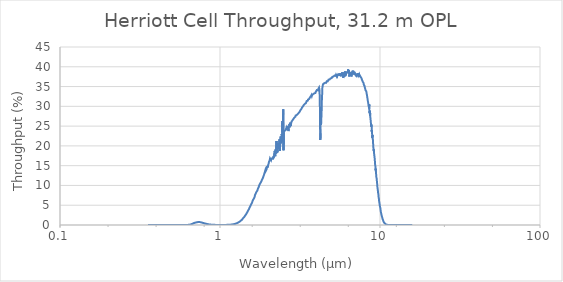
| Category | Throughput (%) |
|---|---|
| 0.355 | 0 |
| 0.365 | 0 |
| 0.375 | 0 |
| 0.385 | 0 |
| 0.395 | 0 |
| 0.405 | 0 |
| 0.415 | 0 |
| 0.425 | 0 |
| 0.435 | 0 |
| 0.445 | 0 |
| 0.455 | 0 |
| 0.465 | 0 |
| 0.475 | 0 |
| 0.485 | 0 |
| 0.495 | 0 |
| 0.505 | 0 |
| 0.515 | 0 |
| 0.525 | 0 |
| 0.535 | 0 |
| 0.545 | 0 |
| 0.555 | 0 |
| 0.565 | 0 |
| 0.575 | 0 |
| 0.585 | 0.001 |
| 0.595 | 0.002 |
| 0.605 | 0.003 |
| 0.615 | 0.008 |
| 0.625 | 0.018 |
| 0.635 | 0.039 |
| 0.645 | 0.078 |
| 0.655 | 0.14 |
| 0.665 | 0.232 |
| 0.675 | 0.349 |
| 0.685 | 0.47 |
| 0.695 | 0.56 |
| 0.705 | 0.643 |
| 0.715 | 0.691 |
| 0.725 | 0.789 |
| 0.735 | 0.77 |
| 0.745 | 0.744 |
| 0.755 | 0.714 |
| 0.765 | 0.652 |
| 0.775 | 0.587 |
| 0.785 | 0.53 |
| 0.795 | 0.453 |
| 0.805 | 0.384 |
| 0.815 | 0.334 |
| 0.825 | 0.275 |
| 0.835 | 0.228 |
| 0.845 | 0.187 |
| 0.855 | 0.152 |
| 0.865 | 0.122 |
| 0.875 | 0.1 |
| 0.885 | 0.08 |
| 0.895 | 0.066 |
| 0.905 | 0.053 |
| 0.915 | 0.043 |
| 0.925 | 0.036 |
| 0.935 | 0.03 |
| 0.945 | 0.025 |
| 0.955 | 0.022 |
| 0.965 | 0.019 |
| 0.975 | 0.017 |
| 0.985 | 0.016 |
| 0.995 | 0.015 |
| 1.005 | 0.015 |
| 1.015 | 0.014 |
| 1.025 | 0.015 |
| 1.035 | 0.015 |
| 1.045 | 0.016 |
| 1.055 | 0.019 |
| 1.065 | 0.021 |
| 1.075 | 0.023 |
| 1.085 | 0.026 |
| 1.095 | 0.029 |
| 1.105 | 0.034 |
| 1.115 | 0.039 |
| 1.125 | 0.045 |
| 1.135 | 0.054 |
| 1.145 | 0.063 |
| 1.155 | 0.074 |
| 1.165 | 0.087 |
| 1.175 | 0.102 |
| 1.185 | 0.121 |
| 1.195 | 0.143 |
| 1.205 | 0.168 |
| 1.215 | 0.195 |
| 1.225 | 0.226 |
| 1.235 | 0.259 |
| 1.245 | 0.303 |
| 1.255 | 0.352 |
| 1.265 | 0.405 |
| 1.275 | 0.456 |
| 1.285 | 0.52 |
| 1.295 | 0.596 |
| 1.305 | 0.67 |
| 1.315 | 0.754 |
| 1.325 | 0.832 |
| 1.335 | 0.934 |
| 1.345 | 1.043 |
| 1.355 | 1.143 |
| 1.365 | 1.284 |
| 1.375 | 1.392 |
| 1.385 | 1.55 |
| 1.395 | 1.722 |
| 1.405 | 1.822 |
| 1.415 | 1.987 |
| 1.425 | 2.148 |
| 1.435 | 2.356 |
| 1.445 | 2.548 |
| 1.455 | 2.698 |
| 1.465 | 2.91 |
| 1.475 | 3.121 |
| 1.485 | 3.31 |
| 1.495 | 3.569 |
| 1.505 | 3.772 |
| 1.515 | 3.989 |
| 1.525 | 4.268 |
| 1.535 | 4.449 |
| 1.545 | 4.706 |
| 1.555 | 4.89 |
| 1.565 | 5.217 |
| 1.575 | 5.321 |
| 1.585 | 5.636 |
| 1.595 | 5.876 |
| 1.605 | 6.26 |
| 1.615 | 6.3 |
| 1.625 | 6.643 |
| 1.635 | 6.896 |
| 1.645 | 7.073 |
| 1.655 | 7.557 |
| 1.665 | 7.686 |
| 1.675 | 7.726 |
| 1.685 | 8.276 |
| 1.695 | 8.248 |
| 1.705 | 8.514 |
| 1.715 | 8.778 |
| 1.725 | 9.16 |
| 1.735 | 9.228 |
| 1.745 | 9.592 |
| 1.755 | 9.816 |
| 1.765 | 10.178 |
| 1.775 | 10.396 |
| 1.785 | 10.539 |
| 1.795 | 10.709 |
| 1.805 | 10.867 |
| 1.815 | 11.021 |
| 1.825 | 11.07 |
| 1.835 | 11.53 |
| 1.845 | 11.704 |
| 1.855 | 11.928 |
| 1.865 | 12.18 |
| 1.875 | 12.469 |
| 1.885 | 12.503 |
| 1.895 | 13.044 |
| 1.905 | 12.936 |
| 1.915 | 13.675 |
| 1.925 | 13.996 |
| 1.935 | 13.692 |
| 1.945 | 13.779 |
| 1.955 | 14.041 |
| 1.965 | 14.038 |
| 1.975 | 14.933 |
| 1.985 | 14.571 |
| 1.995 | 15.079 |
| 2.005 | 15.04 |
| 2.015 | 15.542 |
| 2.025 | 16.019 |
| 2.035 | 16.08 |
| 2.045 | 16.373 |
| 2.055 | 16.833 |
| 2.065 | 16.604 |
| 2.075 | 16.629 |
| 2.085 | 16.395 |
| 2.095 | 16.8 |
| 2.105 | 16.731 |
| 2.115 | 16.66 |
| 2.125 | 16.59 |
| 2.135 | 16.888 |
| 2.145 | 16.606 |
| 2.155 | 17.144 |
| 2.165 | 17.466 |
| 2.175 | 17.093 |
| 2.185 | 18.089 |
| 2.195 | 18.715 |
| 2.205 | 18.358 |
| 2.215 | 17.365 |
| 2.225 | 19.061 |
| 2.235 | 18.347 |
| 2.245 | 18.063 |
| 2.255 | 21.235 |
| 2.265 | 18.253 |
| 2.275 | 19.491 |
| 2.285 | 18.387 |
| 2.295 | 20.122 |
| 2.305 | 19.94 |
| 2.315 | 20.671 |
| 2.325 | 19.267 |
| 2.335 | 20.152 |
| 2.345 | 20.807 |
| 2.355 | 21.665 |
| 2.365 | 18.741 |
| 2.375 | 19.514 |
| 2.385 | 22.047 |
| 2.395 | 22.386 |
| 2.405 | 22.166 |
| 2.415 | 20.646 |
| 2.425 | 20.832 |
| 2.435 | 23.009 |
| 2.445 | 21.188 |
| 2.455 | 26.311 |
| 2.465 | 23.581 |
| 2.475 | 26.264 |
| 2.485 | 29.273 |
| 2.495 | 18.904 |
| 2.505 | 23.476 |
| 2.515 | 23.465 |
| 2.525 | 23.464 |
| 2.535 | 23.845 |
| 2.545 | 23.77 |
| 2.555 | 23.868 |
| 2.565 | 24.016 |
| 2.575 | 23.999 |
| 2.585 | 23.791 |
| 2.595 | 24.472 |
| 2.61 | 24.069 |
| 2.619 | 24.404 |
| 2.63 | 24.73 |
| 2.64 | 25.054 |
| 2.65 | 24.877 |
| 2.659 | 24.951 |
| 2.67 | 24.289 |
| 2.68 | 23.738 |
| 2.689 | 24.238 |
| 2.7 | 25.026 |
| 2.71 | 25.002 |
| 2.719 | 25.543 |
| 2.73 | 25.026 |
| 2.739 | 24.711 |
| 2.749 | 25.871 |
| 2.76 | 24.991 |
| 2.769 | 25.34 |
| 2.78 | 25.629 |
| 2.789 | 25.524 |
| 2.8 | 26.133 |
| 2.809 | 26.311 |
| 2.82 | 26.184 |
| 2.829 | 26.386 |
| 2.839 | 26.475 |
| 2.849 | 26.586 |
| 2.859 | 26.516 |
| 2.87 | 26.714 |
| 2.879 | 26.824 |
| 2.889 | 26.983 |
| 2.899 | 26.963 |
| 2.909 | 27.118 |
| 2.919 | 27.047 |
| 2.929 | 27.143 |
| 2.939 | 27.264 |
| 2.949 | 27.146 |
| 2.959 | 27.371 |
| 2.969 | 27.657 |
| 2.979 | 27.515 |
| 2.989 | 27.591 |
| 2.999 | 27.599 |
| 3.009 | 27.644 |
| 3.019 | 27.819 |
| 3.029 | 27.681 |
| 3.039 | 27.846 |
| 3.049 | 27.993 |
| 3.059 | 27.909 |
| 3.069 | 28.086 |
| 3.079 | 28.047 |
| 3.089 | 28.216 |
| 3.099 | 28.3 |
| 3.109 | 28.369 |
| 3.119 | 28.568 |
| 3.129 | 28.496 |
| 3.139 | 28.596 |
| 3.149 | 28.645 |
| 3.159 | 28.729 |
| 3.169 | 28.857 |
| 3.179 | 29.015 |
| 3.189 | 28.944 |
| 3.199 | 28.877 |
| 3.209 | 29.117 |
| 3.219 | 29.262 |
| 3.229 | 29.367 |
| 3.239 | 29.441 |
| 3.249 | 29.616 |
| 3.259 | 29.727 |
| 3.269 | 29.682 |
| 3.279 | 29.849 |
| 3.289 | 29.842 |
| 3.299 | 29.959 |
| 3.309 | 30.062 |
| 3.319 | 30.038 |
| 3.329 | 30.131 |
| 3.339 | 30.205 |
| 3.349 | 30.417 |
| 3.359 | 30.64 |
| 3.369 | 30.48 |
| 3.379 | 30.495 |
| 3.389 | 30.662 |
| 3.399 | 30.64 |
| 3.409 | 30.671 |
| 3.419 | 30.657 |
| 3.429 | 30.588 |
| 3.439 | 30.853 |
| 3.449 | 30.881 |
| 3.459 | 31.052 |
| 3.469 | 31.121 |
| 3.479 | 31.327 |
| 3.489 | 31.214 |
| 3.499 | 31.28 |
| 3.509 | 31.309 |
| 3.519 | 31.379 |
| 3.529 | 31.212 |
| 3.539 | 31.449 |
| 3.549 | 31.706 |
| 3.559 | 31.851 |
| 3.569 | 31.648 |
| 3.579 | 31.757 |
| 3.589 | 31.771 |
| 3.599 | 31.787 |
| 3.609 | 31.873 |
| 3.619 | 32.071 |
| 3.629 | 32.114 |
| 3.639 | 32.052 |
| 3.649 | 32.267 |
| 3.659 | 32.213 |
| 3.669 | 32.209 |
| 3.679 | 32.199 |
| 3.689 | 32.462 |
| 3.699 | 32.568 |
| 3.709 | 32.603 |
| 3.719 | 32.686 |
| 3.729 | 32.862 |
| 3.739 | 32.723 |
| 3.749 | 32.602 |
| 3.759 | 32.669 |
| 3.769 | 32.901 |
| 3.779 | 32.769 |
| 3.789 | 32.892 |
| 3.799 | 32.893 |
| 3.809 | 33.019 |
| 3.819 | 32.967 |
| 3.829 | 33.112 |
| 3.839 | 33.062 |
| 3.849 | 33.159 |
| 3.859 | 33.295 |
| 3.869 | 33.19 |
| 3.879 | 33.294 |
| 3.889 | 33.303 |
| 3.899 | 33.482 |
| 3.909 | 33.531 |
| 3.919 | 33.456 |
| 3.929 | 33.26 |
| 3.939 | 33.322 |
| 3.949 | 33.374 |
| 3.959 | 33.57 |
| 3.968 | 33.685 |
| 3.979 | 33.749 |
| 3.989 | 33.602 |
| 3.999 | 33.657 |
| 4.009 | 33.827 |
| 4.018 | 33.811 |
| 4.029 | 34.104 |
| 4.039 | 33.975 |
| 4.049 | 33.992 |
| 4.058 | 34.243 |
| 4.069 | 34.214 |
| 4.078 | 34.195 |
| 4.089 | 34.046 |
| 4.098 | 34.209 |
| 4.109 | 34.249 |
| 4.118 | 34.407 |
| 4.129 | 34.486 |
| 4.138 | 34.612 |
| 4.148 | 34.511 |
| 4.159 | 34.75 |
| 4.168 | 34.646 |
| 4.178 | 34.627 |
| 4.189 | 34.024 |
| 4.198 | 32.441 |
| 4.208 | 30.313 |
| 4.218 | 28.028 |
| 4.228 | 22.285 |
| 4.238 | 21.488 |
| 4.248 | 23.218 |
| 4.258 | 27.026 |
| 4.268 | 25.346 |
| 4.278 | 25.284 |
| 4.288 | 25.642 |
| 4.298 | 26.794 |
| 4.308 | 27.859 |
| 4.318 | 28.921 |
| 4.328 | 31.008 |
| 4.338 | 32.16 |
| 4.348 | 32.924 |
| 4.358 | 34.471 |
| 4.368 | 34.861 |
| 4.378 | 34.96 |
| 4.388 | 35.166 |
| 4.398 | 35.529 |
| 4.408 | 35.377 |
| 4.418 | 35.33 |
| 4.428 | 35.413 |
| 4.438 | 35.458 |
| 4.448 | 35.543 |
| 4.458 | 35.638 |
| 4.468 | 35.81 |
| 4.478 | 35.705 |
| 4.488 | 35.612 |
| 4.498 | 35.747 |
| 4.508 | 35.781 |
| 4.518 | 35.861 |
| 4.528 | 35.915 |
| 4.538 | 35.946 |
| 4.548 | 35.945 |
| 4.558 | 35.836 |
| 4.568 | 36.024 |
| 4.578 | 35.982 |
| 4.588 | 36.022 |
| 4.598 | 35.979 |
| 4.608 | 35.937 |
| 4.618 | 35.988 |
| 4.628 | 36.098 |
| 4.638 | 36.073 |
| 4.648 | 36.338 |
| 4.658 | 36.424 |
| 4.668 | 36.24 |
| 4.678 | 36.207 |
| 4.688 | 36.219 |
| 4.698 | 36.3 |
| 4.708 | 36.231 |
| 4.718 | 36.34 |
| 4.728 | 36.453 |
| 4.738 | 36.54 |
| 4.748 | 36.567 |
| 4.758 | 36.556 |
| 4.768 | 36.747 |
| 4.778 | 36.724 |
| 4.788 | 36.591 |
| 4.798 | 36.719 |
| 4.808 | 36.596 |
| 4.818 | 36.65 |
| 4.828 | 36.718 |
| 4.838 | 36.778 |
| 4.848 | 36.728 |
| 4.858 | 36.714 |
| 4.868 | 36.869 |
| 4.878 | 36.851 |
| 4.888 | 36.846 |
| 4.898 | 36.81 |
| 4.908 | 37.07 |
| 4.918 | 37.049 |
| 4.928 | 36.998 |
| 4.938 | 37.097 |
| 4.948 | 37.112 |
| 4.958 | 37.067 |
| 4.968 | 37.097 |
| 4.978 | 37.112 |
| 4.988 | 37.139 |
| 4.998 | 37.045 |
| 5.008 | 36.979 |
| 5.018 | 37.087 |
| 5.028 | 37.158 |
| 5.038 | 37.457 |
| 5.048 | 37.462 |
| 5.058 | 37.416 |
| 5.068 | 37.397 |
| 5.078 | 37.249 |
| 5.088 | 37.29 |
| 5.098 | 37.434 |
| 5.107 | 37.646 |
| 5.118 | 37.539 |
| 5.128 | 37.459 |
| 5.138 | 37.516 |
| 5.147 | 37.363 |
| 5.158 | 37.459 |
| 5.168 | 37.54 |
| 5.178 | 37.563 |
| 5.187 | 37.747 |
| 5.198 | 37.779 |
| 5.208 | 37.562 |
| 5.218 | 37.682 |
| 5.227 | 37.751 |
| 5.238 | 37.706 |
| 5.248 | 37.806 |
| 5.257 | 37.831 |
| 5.268 | 37.747 |
| 5.278 | 37.7 |
| 5.288 | 37.701 |
| 5.297 | 37.69 |
| 5.308 | 37.96 |
| 5.318 | 37.937 |
| 5.327 | 37.928 |
| 5.337 | 38.012 |
| 5.348 | 37.686 |
| 5.358 | 37.665 |
| 5.367 | 37.901 |
| 5.378 | 38.16 |
| 5.388 | 38.177 |
| 5.397 | 38.119 |
| 5.407 | 37.932 |
| 5.418 | 37.751 |
| 5.428 | 37.572 |
| 5.437 | 37.731 |
| 5.448 | 38.121 |
| 5.458 | 38.056 |
| 5.467 | 37.759 |
| 5.477 | 37.75 |
| 5.488 | 37.928 |
| 5.497 | 38.094 |
| 5.507 | 38.162 |
| 5.518 | 38.075 |
| 5.527 | 38.149 |
| 5.537 | 38.332 |
| 5.548 | 38.177 |
| 5.558 | 38.016 |
| 5.567 | 38.108 |
| 5.578 | 37.942 |
| 5.588 | 38.11 |
| 5.597 | 38.351 |
| 5.608 | 38.363 |
| 5.618 | 38.378 |
| 5.627 | 38.473 |
| 5.637 | 38.395 |
| 5.648 | 37.906 |
| 5.657 | 38.022 |
| 5.667 | 38.237 |
| 5.678 | 38.288 |
| 5.687 | 38.25 |
| 5.697 | 38.432 |
| 5.707 | 38.434 |
| 5.717 | 37.614 |
| 5.727 | 37.753 |
| 5.737 | 38.068 |
| 5.747 | 38.363 |
| 5.758 | 38.427 |
| 5.767 | 38.118 |
| 5.777 | 37.788 |
| 5.788 | 38.334 |
| 5.797 | 38.597 |
| 5.807 | 38.77 |
| 5.818 | 38.245 |
| 5.827 | 37.776 |
| 5.837 | 37.924 |
| 5.847 | 38.559 |
| 5.857 | 38.46 |
| 5.867 | 38.213 |
| 5.877 | 37.918 |
| 5.887 | 37.159 |
| 5.898 | 37.425 |
| 5.907 | 37.931 |
| 5.917 | 38.255 |
| 5.927 | 38.129 |
| 5.937 | 37.715 |
| 5.947 | 37.451 |
| 5.957 | 38.185 |
| 5.967 | 38.343 |
| 5.978 | 38.33 |
| 5.987 | 38.098 |
| 5.997 | 38.138 |
| 6.007 | 38.298 |
| 6.017 | 38.258 |
| 6.027 | 38.54 |
| 6.037 | 38.833 |
| 6.047 | 38.601 |
| 6.057 | 37.626 |
| 6.067 | 37.576 |
| 6.077 | 37.618 |
| 6.087 | 38.342 |
| 6.097 | 38.543 |
| 6.107 | 38.374 |
| 6.117 | 37.861 |
| 6.127 | 38.013 |
| 6.137 | 38.211 |
| 6.147 | 38.176 |
| 6.157 | 37.989 |
| 6.167 | 38.179 |
| 6.177 | 38.418 |
| 6.187 | 38.261 |
| 6.197 | 38.321 |
| 6.207 | 38.43 |
| 6.217 | 38.444 |
| 6.227 | 38.556 |
| 6.237 | 38.685 |
| 6.247 | 38.808 |
| 6.257 | 38.842 |
| 6.267 | 38.636 |
| 6.277 | 38.411 |
| 6.287 | 38.34 |
| 6.297 | 38.598 |
| 6.307 | 38.94 |
| 6.317 | 39.357 |
| 6.327 | 39.455 |
| 6.337 | 38.995 |
| 6.347 | 38.502 |
| 6.357 | 38.651 |
| 6.367 | 38.665 |
| 6.377 | 38.58 |
| 6.387 | 38.697 |
| 6.397 | 39.137 |
| 6.407 | 38.842 |
| 6.417 | 37.928 |
| 6.427 | 37.553 |
| 6.437 | 37.884 |
| 6.446 | 38.202 |
| 6.457 | 38.71 |
| 6.467 | 38.742 |
| 6.477 | 38.539 |
| 6.487 | 38.115 |
| 6.497 | 37.686 |
| 6.507 | 37.965 |
| 6.517 | 38.173 |
| 6.527 | 38.341 |
| 6.537 | 38.504 |
| 6.547 | 38.545 |
| 6.557 | 38.425 |
| 6.567 | 37.897 |
| 6.577 | 37.672 |
| 6.587 | 37.681 |
| 6.597 | 38.179 |
| 6.607 | 38.472 |
| 6.617 | 38.62 |
| 6.627 | 37.998 |
| 6.637 | 37.547 |
| 6.647 | 37.74 |
| 6.657 | 38.234 |
| 6.666 | 38.655 |
| 6.677 | 38.58 |
| 6.686 | 38.583 |
| 6.697 | 38.701 |
| 6.706 | 38.504 |
| 6.717 | 38.258 |
| 6.726 | 38.366 |
| 6.737 | 39.009 |
| 6.746 | 39.166 |
| 6.757 | 39.202 |
| 6.766 | 38.97 |
| 6.777 | 38.697 |
| 6.787 | 38.417 |
| 6.797 | 38.668 |
| 6.807 | 38.943 |
| 6.816 | 39.061 |
| 6.827 | 38.987 |
| 6.836 | 38.871 |
| 6.847 | 38.842 |
| 6.856 | 38.526 |
| 6.867 | 38.05 |
| 6.876 | 38.275 |
| 6.887 | 38.589 |
| 6.897 | 38.724 |
| 6.906 | 38.538 |
| 6.917 | 38.501 |
| 6.926 | 38.561 |
| 6.937 | 38.748 |
| 6.946 | 38.648 |
| 6.956 | 38.392 |
| 6.967 | 38.096 |
| 6.976 | 38.216 |
| 6.987 | 38.335 |
| 6.996 | 38.33 |
| 7.007 | 38.281 |
| 7.016 | 38.242 |
| 7.026 | 38.168 |
| 7.037 | 37.964 |
| 7.046 | 37.854 |
| 7.057 | 37.825 |
| 7.066 | 38.123 |
| 7.076 | 38.231 |
| 7.087 | 38.269 |
| 7.096 | 38.24 |
| 7.107 | 38.138 |
| 7.116 | 38.136 |
| 7.126 | 38.153 |
| 7.137 | 38.072 |
| 7.146 | 37.915 |
| 7.156 | 37.824 |
| 7.166 | 37.827 |
| 7.176 | 38.06 |
| 7.187 | 38.142 |
| 7.196 | 38.15 |
| 7.206 | 37.992 |
| 7.217 | 38.011 |
| 7.226 | 38.104 |
| 7.236 | 38.302 |
| 7.246 | 38.258 |
| 7.256 | 38.161 |
| 7.266 | 38.046 |
| 7.276 | 37.961 |
| 7.286 | 38.055 |
| 7.296 | 38.175 |
| 7.306 | 38.295 |
| 7.316 | 38.184 |
| 7.327 | 38.014 |
| 7.336 | 37.8 |
| 7.346 | 37.594 |
| 7.357 | 37.613 |
| 7.366 | 37.689 |
| 7.376 | 37.847 |
| 7.386 | 37.916 |
| 7.396 | 38.013 |
| 7.406 | 38.124 |
| 7.416 | 38.088 |
| 7.426 | 38.02 |
| 7.436 | 37.945 |
| 7.446 | 37.766 |
| 7.456 | 37.56 |
| 7.466 | 37.379 |
| 7.476 | 37.354 |
| 7.486 | 37.496 |
| 7.496 | 37.609 |
| 7.506 | 37.677 |
| 7.516 | 37.595 |
| 7.526 | 37.516 |
| 7.536 | 37.472 |
| 7.546 | 37.519 |
| 7.556 | 37.52 |
| 7.566 | 37.483 |
| 7.576 | 37.431 |
| 7.586 | 37.397 |
| 7.596 | 37.367 |
| 7.606 | 37.331 |
| 7.616 | 37.261 |
| 7.626 | 37.197 |
| 7.636 | 37.146 |
| 7.646 | 37.173 |
| 7.656 | 37.158 |
| 7.666 | 37.072 |
| 7.676 | 36.897 |
| 7.686 | 36.825 |
| 7.696 | 36.81 |
| 7.706 | 36.829 |
| 7.716 | 36.894 |
| 7.726 | 36.837 |
| 7.736 | 36.724 |
| 7.746 | 36.55 |
| 7.756 | 36.478 |
| 7.766 | 36.424 |
| 7.776 | 36.388 |
| 7.786 | 36.332 |
| 7.796 | 36.258 |
| 7.806 | 36.168 |
| 7.816 | 36.082 |
| 7.826 | 36.073 |
| 7.836 | 36.088 |
| 7.846 | 36.205 |
| 7.855 | 36.209 |
| 7.866 | 36.189 |
| 7.876 | 36.148 |
| 7.886 | 36.025 |
| 7.896 | 35.854 |
| 7.905 | 35.685 |
| 7.916 | 35.5 |
| 7.926 | 35.406 |
| 7.936 | 35.35 |
| 7.946 | 35.32 |
| 7.955 | 35.374 |
| 7.966 | 35.347 |
| 7.976 | 35.299 |
| 7.986 | 35.27 |
| 7.996 | 35.205 |
| 8.005 | 35.123 |
| 8.016 | 34.98 |
| 8.026 | 34.862 |
| 8.036 | 34.751 |
| 8.046 | 34.662 |
| 8.056 | 34.608 |
| 8.065 | 34.559 |
| 8.075 | 34.514 |
| 8.086 | 34.468 |
| 8.096 | 34.345 |
| 8.106 | 34.213 |
| 8.116 | 34.08 |
| 8.125 | 34.02 |
| 8.135 | 33.981 |
| 8.146 | 33.957 |
| 8.156 | 34.042 |
| 8.166 | 34.021 |
| 8.176 | 33.999 |
| 8.186 | 33.975 |
| 8.195 | 33.9 |
| 8.205 | 33.846 |
| 8.215 | 33.763 |
| 8.226 | 33.597 |
| 8.236 | 33.407 |
| 8.246 | 33.213 |
| 8.256 | 33.152 |
| 8.266 | 33.114 |
| 8.275 | 33.058 |
| 8.285 | 32.993 |
| 8.295 | 32.82 |
| 8.305 | 32.623 |
| 8.315 | 32.448 |
| 8.326 | 32.299 |
| 8.336 | 32.175 |
| 8.346 | 32.075 |
| 8.356 | 31.949 |
| 8.366 | 31.769 |
| 8.375 | 31.624 |
| 8.385 | 31.443 |
| 8.395 | 31.311 |
| 8.405 | 31.204 |
| 8.415 | 31.12 |
| 8.425 | 31.085 |
| 8.435 | 30.948 |
| 8.445 | 30.809 |
| 8.455 | 30.595 |
| 8.465 | 30.454 |
| 8.476 | 30.287 |
| 8.486 | 30.144 |
| 8.496 | 30.023 |
| 8.506 | 29.901 |
| 8.516 | 29.996 |
| 8.526 | 30.133 |
| 8.536 | 29.64 |
| 8.555 | 29.392 |
| 8.565 | 30.483 |
| 8.575 | 29.327 |
| 8.585 | 29.146 |
| 8.595 | 28.692 |
| 8.605 | 28.513 |
| 8.615 | 28.302 |
| 8.625 | 28.887 |
| 8.635 | 28.364 |
| 8.645 | 27.975 |
| 8.655 | 27.626 |
| 8.665 | 27.889 |
| 8.675 | 28.266 |
| 8.685 | 27.976 |
| 8.695 | 27.473 |
| 8.705 | 27.191 |
| 8.715 | 27.366 |
| 8.735 | 26.622 |
| 8.745 | 26.326 |
| 8.755 | 26.153 |
| 8.765 | 26.267 |
| 8.775 | 25.766 |
| 8.785 | 25.605 |
| 8.795 | 25.462 |
| 8.805 | 24.895 |
| 8.815 | 25.403 |
| 8.825 | 25.288 |
| 8.835 | 25.234 |
| 8.845 | 25.349 |
| 8.855 | 25.513 |
| 8.865 | 24.776 |
| 8.875 | 24.255 |
| 8.885 | 23.579 |
| 8.895 | 24.016 |
| 8.905 | 23.38 |
| 8.925 | 23.243 |
| 8.935 | 22.851 |
| 8.945 | 23.048 |
| 8.955 | 22.071 |
| 8.965 | 22.71 |
| 8.975 | 22.847 |
| 8.985 | 22.182 |
| 8.995 | 21.857 |
| 9.005 | 21.952 |
| 9.015 | 21.706 |
| 9.035 | 21.521 |
| 9.045 | 21.173 |
| 9.055 | 20.679 |
| 9.065 | 20.251 |
| 9.075 | 20.481 |
| 9.085 | 19.665 |
| 9.095 | 19.89 |
| 9.115 | 19.104 |
| 9.125 | 19.33 |
| 9.135 | 19.105 |
| 9.145 | 18.695 |
| 9.155 | 19.089 |
| 9.175 | 18.366 |
| 9.185 | 18.512 |
| 9.195 | 17.897 |
| 9.205 | 17.74 |
| 9.215 | 17.587 |
| 9.235 | 17.442 |
| 9.245 | 17.347 |
| 9.255 | 16.977 |
| 9.265 | 16.859 |
| 9.275 | 16.473 |
| 9.295 | 16.07 |
| 9.305 | 15.567 |
| 9.314 | 15.521 |
| 9.325 | 15.249 |
| 9.345 | 15.069 |
| 9.355 | 14.92 |
| 9.364 | 14.888 |
| 9.375 | 14.254 |
| 9.385 | 14.421 |
| 9.395 | 13.931 |
| 9.404 | 13.869 |
| 9.415 | 14.22 |
| 9.425 | 13.521 |
| 9.435 | 13.724 |
| 9.444 | 13.44 |
| 9.455 | 13.308 |
| 9.465 | 12.697 |
| 9.475 | 12.338 |
| 9.484 | 12.379 |
| 9.495 | 12.032 |
| 9.505 | 12.13 |
| 9.515 | 11.903 |
| 9.524 | 12.227 |
| 9.535 | 11.695 |
| 9.545 | 11.775 |
| 9.554 | 11.481 |
| 9.564 | 11.034 |
| 9.575 | 10.821 |
| 9.585 | 10.794 |
| 9.594 | 10.535 |
| 9.605 | 10.192 |
| 9.615 | 10.14 |
| 9.624 | 9.749 |
| 9.634 | 9.701 |
| 9.645 | 9.403 |
| 9.654 | 9.495 |
| 9.664 | 9.605 |
| 9.675 | 9.099 |
| 9.684 | 9.262 |
| 9.694 | 8.758 |
| 9.705 | 8.687 |
| 9.714 | 8.668 |
| 9.724 | 8.367 |
| 9.735 | 8.09 |
| 9.744 | 7.846 |
| 9.754 | 8.107 |
| 9.765 | 7.788 |
| 9.774 | 7.579 |
| 9.784 | 7.428 |
| 9.795 | 7.118 |
| 9.804 | 7.253 |
| 9.815 | 7.009 |
| 9.824 | 6.832 |
| 9.834 | 6.821 |
| 9.845 | 6.658 |
| 9.854 | 6.553 |
| 9.864 | 6.248 |
| 9.875 | 5.991 |
| 9.884 | 6.098 |
| 9.895 | 5.848 |
| 9.904 | 5.823 |
| 9.914 | 5.824 |
| 9.924 | 5.536 |
| 9.934 | 5.41 |
| 9.945 | 5.235 |
| 9.954 | 5.165 |
| 9.964 | 4.871 |
| 9.974 | 4.823 |
| 9.984 | 4.64 |
| 9.994 | 4.712 |
| 10.004 | 4.693 |
| 10.015 | 4.537 |
| 10.024 | 4.639 |
| 10.034 | 4.322 |
| 10.044 | 4.377 |
| 10.054 | 4.2 |
| 10.064 | 3.988 |
| 10.074 | 3.932 |
| 10.084 | 3.841 |
| 10.094 | 3.662 |
| 10.104 | 3.677 |
| 10.114 | 3.326 |
| 10.124 | 3.465 |
| 10.134 | 3.316 |
| 10.144 | 3.223 |
| 10.154 | 3.06 |
| 10.164 | 3.101 |
| 10.174 | 3.019 |
| 10.184 | 3.051 |
| 10.194 | 2.748 |
| 10.204 | 2.753 |
| 10.214 | 2.664 |
| 10.224 | 2.572 |
| 10.234 | 2.444 |
| 10.244 | 2.329 |
| 10.254 | 2.412 |
| 10.264 | 2.356 |
| 10.274 | 2.164 |
| 10.284 | 2.196 |
| 10.294 | 2.18 |
| 10.304 | 2.012 |
| 10.314 | 1.913 |
| 10.324 | 1.919 |
| 10.334 | 1.872 |
| 10.344 | 1.731 |
| 10.354 | 1.701 |
| 10.364 | 1.586 |
| 10.374 | 1.667 |
| 10.384 | 1.6 |
| 10.394 | 1.507 |
| 10.404 | 1.433 |
| 10.414 | 1.527 |
| 10.424 | 1.349 |
| 10.434 | 1.346 |
| 10.444 | 1.244 |
| 10.454 | 1.183 |
| 10.464 | 1.192 |
| 10.474 | 1.155 |
| 10.484 | 1.143 |
| 10.494 | 1.021 |
| 10.504 | 0.967 |
| 10.514 | 1.002 |
| 10.524 | 0.985 |
| 10.534 | 0.882 |
| 10.544 | 0.841 |
| 10.554 | 0.851 |
| 10.564 | 0.711 |
| 10.574 | 0.728 |
| 10.584 | 0.739 |
| 10.594 | 0.721 |
| 10.604 | 0.621 |
| 10.614 | 0.575 |
| 10.624 | 0.653 |
| 10.634 | 0.626 |
| 10.644 | 0.558 |
| 10.654 | 0.557 |
| 10.664 | 0.496 |
| 10.674 | 0.534 |
| 10.684 | 0.454 |
| 10.694 | 0.419 |
| 10.704 | 0.439 |
| 10.714 | 0.46 |
| 10.723 | 0.375 |
| 10.734 | 0.317 |
| 10.744 | 0.328 |
| 10.754 | 0.3 |
| 10.763 | 0.319 |
| 10.774 | 0.335 |
| 10.784 | 0.252 |
| 10.794 | 0.291 |
| 10.803 | 0.238 |
| 10.814 | 0.236 |
| 10.824 | 0.205 |
| 10.834 | 0.215 |
| 10.843 | 0.218 |
| 10.854 | 0.196 |
| 10.864 | 0.159 |
| 10.874 | 0.15 |
| 10.883 | 0.171 |
| 10.893 | 0.192 |
| 10.904 | 0.131 |
| 10.914 | 0.154 |
| 10.924 | 0.125 |
| 10.933 | 0.118 |
| 10.943 | 0.112 |
| 10.954 | 0.107 |
| 10.964 | 0.101 |
| 10.974 | 0.096 |
| 10.984 | 0.092 |
| 10.993 | 0.087 |
| 11.003 | 0.083 |
| 11.014 | 0.079 |
| 11.024 | 0.075 |
| 11.034 | 0.071 |
| 11.044 | 0.067 |
| 11.053 | 0.064 |
| 11.063 | 0.06 |
| 11.073 | 0.057 |
| 11.083 | 0.054 |
| 11.094 | 0.051 |
| 11.104 | 0.048 |
| 11.114 | 0.046 |
| 11.124 | 0.043 |
| 11.133 | 0.041 |
| 11.143 | 0.039 |
| 11.153 | 0.037 |
| 11.163 | 0.035 |
| 11.173 | 0.033 |
| 11.183 | 0.031 |
| 11.193 | 0.029 |
| 11.204 | 0.027 |
| 11.214 | 0.026 |
| 11.224 | 0.024 |
| 11.234 | 0.023 |
| 11.244 | 0.021 |
| 11.254 | 0.02 |
| 11.264 | 0.019 |
| 11.273 | 0.018 |
| 11.283 | 0.017 |
| 11.293 | 0.016 |
| 11.303 | 0.015 |
| 11.313 | 0.014 |
| 11.323 | 0.013 |
| 11.333 | 0.012 |
| 11.343 | 0.012 |
| 11.353 | 0.011 |
| 11.363 | 0.01 |
| 11.373 | 0.009 |
| 11.383 | 0.009 |
| 11.393 | 0.008 |
| 11.403 | 0.008 |
| 11.413 | 0.007 |
| 11.423 | 0.007 |
| 11.433 | 0.006 |
| 11.443 | 0.006 |
| 11.453 | 0.005 |
| 11.464 | 0.005 |
| 11.474 | 0.005 |
| 11.483 | 0.004 |
| 11.493 | 0.004 |
| 11.503 | 0.004 |
| 11.513 | 0.003 |
| 11.523 | 0.003 |
| 11.533 | 0.003 |
| 11.543 | 0.003 |
| 11.553 | 0.003 |
| 11.563 | 0.002 |
| 11.573 | 0.002 |
| 11.583 | 0.002 |
| 11.593 | 0.002 |
| 11.603 | 0.002 |
| 11.613 | 0.002 |
| 11.623 | 0.001 |
| 11.633 | 0.001 |
| 11.643 | 0.001 |
| 11.653 | 0.001 |
| 11.663 | 0.001 |
| 11.673 | 0.001 |
| 11.683 | 0.001 |
| 11.693 | 0.001 |
| 11.703 | 0.001 |
| 11.713 | 0.001 |
| 11.723 | 0.001 |
| 11.733 | 0 |
| 11.743 | 0 |
| 11.753 | 0 |
| 11.763 | 0 |
| 11.773 | 0 |
| 11.783 | 0 |
| 11.793 | 0 |
| 11.803 | 0 |
| 11.813 | 0 |
| 11.823 | 0 |
| 11.833 | 0 |
| 11.843 | 0 |
| 11.853 | 0 |
| 11.863 | 0 |
| 11.873 | 0 |
| 11.883 | 0 |
| 11.893 | 0 |
| 11.903 | 0 |
| 11.913 | 0 |
| 11.923 | 0 |
| 11.933 | 0 |
| 11.943 | 0 |
| 11.953 | 0 |
| 11.963 | 0 |
| 11.973 | 0 |
| 11.983 | 0 |
| 11.993 | 0 |
| 12.003 | 0 |
| 12.013 | 0 |
| 12.023 | 0 |
| 12.033 | 0 |
| 12.043 | 0 |
| 12.053 | 0 |
| 12.063 | 0 |
| 12.073 | 0 |
| 12.083 | 0 |
| 12.093 | 0 |
| 12.103 | 0 |
| 12.113 | 0 |
| 12.122 | 0 |
| 12.133 | 0 |
| 12.143 | 0 |
| 12.153 | 0 |
| 12.163 | 0 |
| 12.172 | 0 |
| 12.183 | 0 |
| 12.193 | 0 |
| 12.203 | 0 |
| 12.213 | 0 |
| 12.223 | 0 |
| 12.233 | 0 |
| 12.242 | 0 |
| 12.253 | 0 |
| 12.262 | 0 |
| 12.273 | 0 |
| 12.282 | 0 |
| 12.293 | 0 |
| 12.302 | 0 |
| 12.313 | 0 |
| 12.323 | 0 |
| 12.333 | 0 |
| 12.342 | 0 |
| 12.353 | 0 |
| 12.362 | 0 |
| 12.373 | 0 |
| 12.382 | 0 |
| 12.393 | 0 |
| 12.402 | 0 |
| 12.413 | 0 |
| 12.422 | 0 |
| 12.433 | 0 |
| 12.442 | 0 |
| 12.452 | 0 |
| 12.463 | 0 |
| 12.472 | 0 |
| 12.483 | 0 |
| 12.492 | 0 |
| 12.503 | 0 |
| 12.513 | 0 |
| 12.522 | 0 |
| 12.533 | 0 |
| 12.542 | 0 |
| 12.552 | 0 |
| 12.563 | 0 |
| 12.572 | 0 |
| 12.583 | 0 |
| 12.593 | 0 |
| 12.602 | 0 |
| 12.613 | 0 |
| 12.622 | 0 |
| 12.632 | 0 |
| 12.643 | 0 |
| 12.653 | 0 |
| 12.662 | 0 |
| 12.672 | 0 |
| 12.683 | 0 |
| 12.692 | 0 |
| 12.702 | 0 |
| 12.713 | 0 |
| 12.722 | 0 |
| 12.732 | 0 |
| 12.742 | 0 |
| 12.753 | 0 |
| 12.762 | 0 |
| 12.772 | 0 |
| 12.782 | 0 |
| 12.793 | 0 |
| 12.802 | 0 |
| 12.812 | 0 |
| 12.822 | 0 |
| 12.832 | 0 |
| 12.843 | 0 |
| 12.852 | 0 |
| 12.862 | 0 |
| 12.872 | 0 |
| 12.882 | 0 |
| 12.892 | 0 |
| 12.902 | 0 |
| 12.912 | 0 |
| 12.922 | 0 |
| 12.932 | 0 |
| 12.942 | 0 |
| 12.952 | 0 |
| 12.962 | 0 |
| 12.972 | 0 |
| 12.982 | 0 |
| 12.992 | 0 |
| 13.002 | 0 |
| 13.012 | 0 |
| 13.022 | 0 |
| 13.032 | 0 |
| 13.042 | 0 |
| 13.052 | 0 |
| 13.062 | 0 |
| 13.072 | 0 |
| 13.082 | 0 |
| 13.092 | 0 |
| 13.102 | 0 |
| 13.112 | 0 |
| 13.122 | 0 |
| 13.132 | 0 |
| 13.142 | 0 |
| 13.152 | 0 |
| 13.162 | 0 |
| 13.172 | 0 |
| 13.182 | 0 |
| 13.192 | 0 |
| 13.202 | 0 |
| 13.212 | 0 |
| 13.222 | 0 |
| 13.232 | 0 |
| 13.242 | 0 |
| 13.252 | 0 |
| 13.262 | 0 |
| 13.272 | 0 |
| 13.282 | 0 |
| 13.292 | 0 |
| 13.302 | 0 |
| 13.312 | 0 |
| 13.322 | 0 |
| 13.332 | 0 |
| 13.342 | 0 |
| 13.352 | 0 |
| 13.362 | 0 |
| 13.372 | 0 |
| 13.382 | 0 |
| 13.392 | 0 |
| 13.402 | 0 |
| 13.412 | 0 |
| 13.422 | 0 |
| 13.432 | 0 |
| 13.442 | 0 |
| 13.452 | 0 |
| 13.462 | 0 |
| 13.472 | 0 |
| 13.482 | 0 |
| 13.492 | 0 |
| 13.502 | 0 |
| 13.512 | 0 |
| 13.522 | 0 |
| 13.532 | 0 |
| 13.542 | 0 |
| 13.551 | 0 |
| 13.562 | 0 |
| 13.572 | 0 |
| 13.582 | 0 |
| 13.592 | 0 |
| 13.602 | 0 |
| 13.612 | 0 |
| 13.621 | 0 |
| 13.632 | 0 |
| 13.642 | 0 |
| 13.651 | 0 |
| 13.662 | 0 |
| 13.672 | 0 |
| 13.682 | 0 |
| 13.692 | 0 |
| 13.701 | 0 |
| 13.712 | 0 |
| 13.722 | 0 |
| 13.731 | 0 |
| 13.742 | 0 |
| 13.751 | 0 |
| 13.762 | 0 |
| 13.772 | 0 |
| 13.782 | 0 |
| 13.792 | 0 |
| 13.801 | 0 |
| 13.812 | 0 |
| 13.821 | 0 |
| 13.832 | 0 |
| 13.841 | 0 |
| 13.852 | 0 |
| 13.861 | 0 |
| 13.872 | 0 |
| 13.881 | 0 |
| 13.892 | 0 |
| 13.901 | 0 |
| 13.912 | 0 |
| 13.921 | 0 |
| 13.932 | 0 |
| 13.941 | 0 |
| 13.951 | 0 |
| 13.962 | 0 |
| 13.971 | 0 |
| 13.982 | 0 |
| 13.991 | 0 |
| 14.001 | 0 |
| 14.012 | 0 |
| 14.021 | 0 |
| 14.032 | 0 |
| 14.041 | 0 |
| 14.051 | 0 |
| 14.062 | 0 |
| 14.071 | 0 |
| 14.081 | 0 |
| 14.092 | 0 |
| 14.101 | 0 |
| 14.111 | 0 |
| 14.122 | 0 |
| 14.131 | 0 |
| 14.141 | 0 |
| 14.151 | 0 |
| 14.162 | 0 |
| 14.171 | 0 |
| 14.181 | 0 |
| 14.191 | 0 |
| 14.202 | 0 |
| 14.211 | 0 |
| 14.221 | 0 |
| 14.231 | 0 |
| 14.241 | 0 |
| 14.251 | 0 |
| 14.261 | 0 |
| 14.271 | 0 |
| 14.281 | 0 |
| 14.291 | 0 |
| 14.301 | 0 |
| 14.311 | 0 |
| 14.321 | 0 |
| 14.331 | 0 |
| 14.341 | 0 |
| 14.351 | 0 |
| 14.361 | 0 |
| 14.371 | 0 |
| 14.381 | 0 |
| 14.391 | 0 |
| 14.401 | 0 |
| 14.411 | 0 |
| 14.421 | 0 |
| 14.431 | 0 |
| 14.441 | 0 |
| 14.451 | 0 |
| 14.461 | 0 |
| 14.471 | 0 |
| 14.481 | 0 |
| 14.491 | 0 |
| 14.501 | 0 |
| 14.511 | 0 |
| 14.521 | 0 |
| 14.531 | 0 |
| 14.541 | 0 |
| 14.551 | 0 |
| 14.561 | 0 |
| 14.571 | 0 |
| 14.581 | 0 |
| 14.591 | 0 |
| 14.601 | 0 |
| 14.611 | 0 |
| 14.621 | 0 |
| 14.631 | 0 |
| 14.641 | 0 |
| 14.651 | 0 |
| 14.661 | 0 |
| 14.671 | 0 |
| 14.681 | 0 |
| 14.691 | 0 |
| 14.701 | 0 |
| 14.711 | 0 |
| 14.721 | 0 |
| 14.731 | 0 |
| 14.741 | 0 |
| 14.751 | 0 |
| 14.761 | 0 |
| 14.771 | 0 |
| 14.781 | 0 |
| 14.791 | 0 |
| 14.801 | 0 |
| 14.811 | 0 |
| 14.821 | 0 |
| 14.831 | 0 |
| 14.841 | 0 |
| 14.851 | 0 |
| 14.861 | 0 |
| 14.871 | 0 |
| 14.881 | 0 |
| 14.891 | 0 |
| 14.901 | 0 |
| 14.911 | 0 |
| 14.921 | 0 |
| 14.931 | 0 |
| 14.941 | 0 |
| 14.951 | 0 |
| 14.96 | 0 |
| 14.971 | 0 |
| 14.981 | 0 |
| 14.991 | 0 |
| 15.001 | 0 |
| 15.011 | 0 |
| 15.021 | 0 |
| 15.031 | 0 |
| 15.041 | 0 |
| 15.051 | 0 |
| 15.06 | 0 |
| 15.071 | 0 |
| 15.08 | 0 |
| 15.091 | 0 |
| 15.101 | 0 |
| 15.111 | 0 |
| 15.121 | 0 |
| 15.13 | 0 |
| 15.141 | 0 |
| 15.151 | 0 |
| 15.161 | 0 |
| 15.171 | 0 |
| 15.18 | 0 |
| 15.191 | 0 |
| 15.201 | 0 |
| 15.21 | 0 |
| 15.22 | 0 |
| 15.231 | 0 |
| 15.241 | 0 |
| 15.25 | 0 |
| 15.261 | 0 |
| 15.271 | 0 |
| 15.281 | 0 |
| 15.29 | 0 |
| 15.3 | 0 |
| 15.311 | 0 |
| 15.321 | 0 |
| 15.33 | 0 |
| 15.34 | 0 |
| 15.35 | 0 |
| 15.36 | 0 |
| 15.371 | 0 |
| 15.381 | 0 |
| 15.391 | 0 |
| 15.4 | 0 |
| 15.41 | 0 |
| 15.42 | 0 |
| 15.43 | 0 |
| 15.44 | 0 |
| 15.45 | 0 |
| 15.46 | 0 |
| 15.47 | 0 |
| 15.48 | 0 |
| 15.49 | 0 |
| 15.5 | 0 |
| 15.51 | 0 |
| 15.52 | 0 |
| 15.53 | 0 |
| 15.54 | 0 |
| 15.55 | 0 |
| 15.56 | 0 |
| 15.57 | 0 |
| 15.58 | 0 |
| 15.59 | 0 |
| 15.6 | 0 |
| 15.61 | 0 |
| 15.621 | 0 |
| 15.63 | 0 |
| 15.64 | 0 |
| 15.65 | 0 |
| 15.66 | 0 |
| 15.67 | 0 |
| 15.68 | 0 |
| 15.69 | 0 |
| 15.7 | 0 |
| 15.71 | 0 |
| 15.72 | 0 |
| 15.73 | 0 |
| 15.74 | 0 |
| 15.75 | 0 |
| 15.76 | 0 |
| 15.77 | 0 |
| 15.78 | 0 |
| 15.79 | 0 |
| 15.8 | 0 |
| 15.81 | 0 |
| 15.82 | 0 |
| 15.83 | 0 |
| 15.84 | 0 |
| 15.85 | 0 |
| 15.86 | 0 |
| 15.87 | 0 |
| 15.88 | 0.001 |
| 15.89 | 0.001 |
| 15.9 | 0.001 |
| 15.91 | 0.001 |
| 15.92 | 0.001 |
| 15.93 | 0.001 |
| 15.94 | 0.001 |
| 15.95 | 0.001 |
| 15.96 | 0.001 |
| 15.97 | 0.001 |
| 15.98 | 0.001 |
| 15.99 | 0.001 |
| 16.0 | 0.001 |